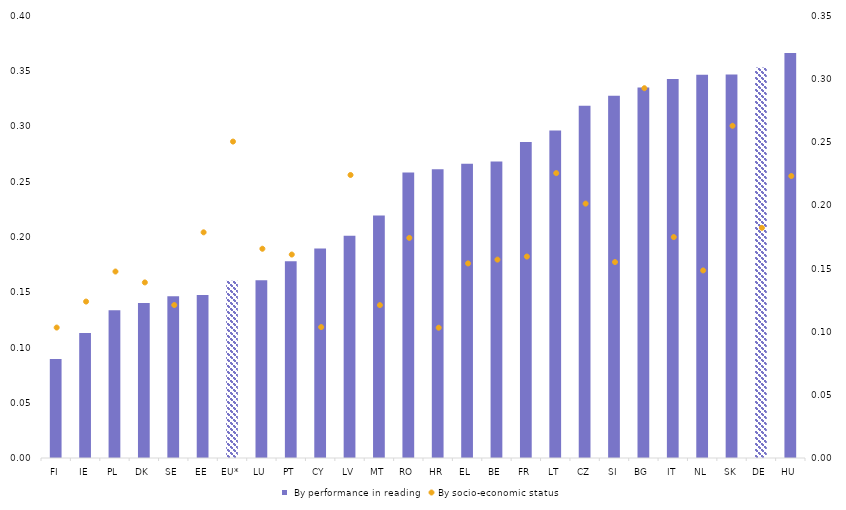
| Category |  By performance in reading |
|---|---|
| FI | 0.089 |
| IE | 0.113 |
| PL | 0.133 |
| DK | 0.14 |
| SE | 0.146 |
| EE | 0.147 |
| EU* | 0.16 |
| LU | 0.161 |
| PT | 0.178 |
| CY | 0.189 |
| LV | 0.201 |
| MT | 0.219 |
| RO | 0.258 |
| HR | 0.261 |
| EL | 0.266 |
| BE | 0.268 |
| FR | 0.285 |
| LT | 0.296 |
| CZ | 0.318 |
| SI | 0.327 |
| BG | 0.334 |
| IT | 0.342 |
| NL | 0.346 |
| SK | 0.346 |
| DE | 0.352 |
| HU | 0.366 |